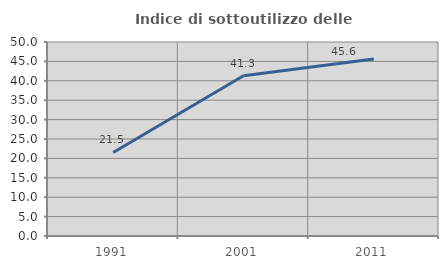
| Category | Indice di sottoutilizzo delle abitazioni  |
|---|---|
| 1991.0 | 21.541 |
| 2001.0 | 41.299 |
| 2011.0 | 45.628 |